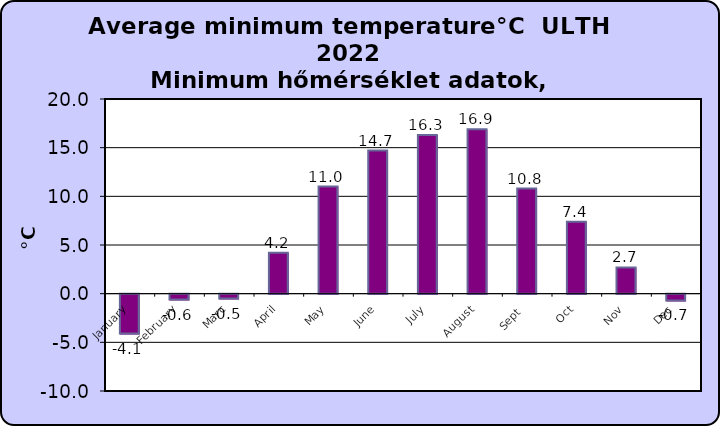
| Category | Series 0 |
|---|---|
| January | -4.1 |
| February | -0.6 |
| Marc | -0.5 |
| April | 4.2 |
| May | 11 |
| June | 14.7 |
| July | 16.3 |
| August | 16.9 |
| Sept  | 10.8 |
| Oct | 7.4 |
| Nov | 2.7 |
| Dec | -0.7 |